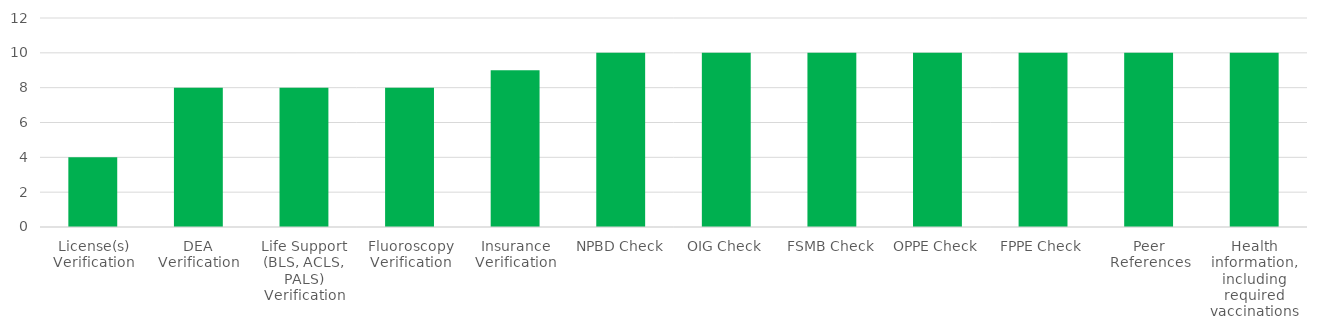
| Category | Series 0 | Series 10 |
|---|---|---|
| License(s) Verification | 0 | 4 |
| DEA Verification | 0 | 8 |
| Life Support (BLS, ACLS, PALS) Verification | 0 | 8 |
| Fluoroscopy Verification | 0 | 8 |
| Insurance Verification | 0 | 9 |
| NPBD Check | 0 | 10 |
| OIG Check | 0 | 10 |
| FSMB Check | 0 | 10 |
| OPPE Check | 0 | 10 |
| FPPE Check | 0 | 10 |
| Peer References | 0 | 10 |
| Health information, including required vaccinations | 0 | 10 |